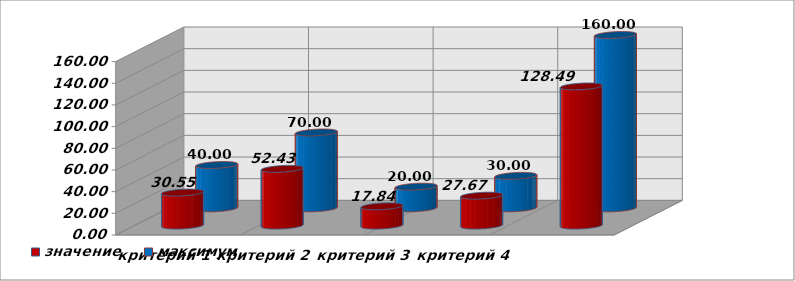
| Category | значение | максимум |
|---|---|---|
| критерий 1 | 30.548 | 40 |
| критерий 2 | 52.429 | 70 |
| критерий 3 | 17.843 | 20 |
| критерий 4 | 27.67 | 30 |